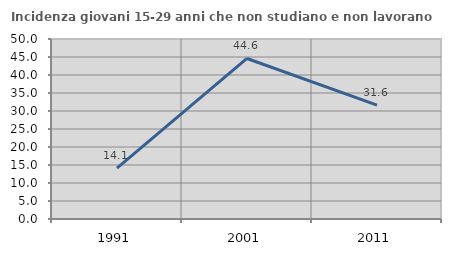
| Category | Incidenza giovani 15-29 anni che non studiano e non lavorano  |
|---|---|
| 1991.0 | 14.105 |
| 2001.0 | 44.589 |
| 2011.0 | 31.636 |